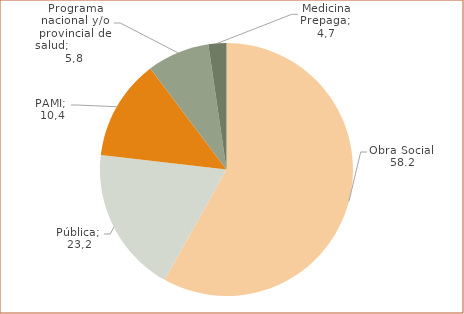
| Category | Series 0 |
|---|---|
| Obra Social | 58.2 |
| Pública | 18.7 |
| PAMI | 12.9 |
| Programa nacional y/o provincial de salud | 8 |
| Medicina Prepaga | 2.3 |